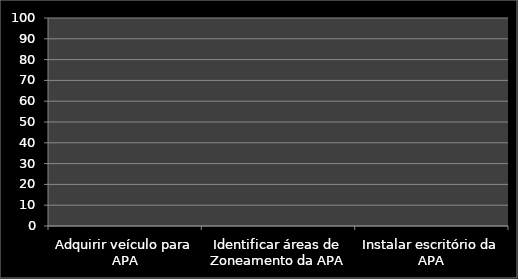
| Category | Inicio % | % |
|---|---|---|
| Adquirir veículo para APA | 0 | 0 |
| Identificar áreas de Zoneamento da APA | 0 | 0 |
| Instalar escritório da APA | 0 | 0 |